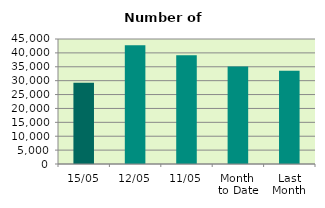
| Category | Series 0 |
|---|---|
| 15/05 | 29244 |
| 12/05 | 42752 |
| 11/05 | 39122 |
| Month 
to Date | 35114 |
| Last
Month | 33588.111 |